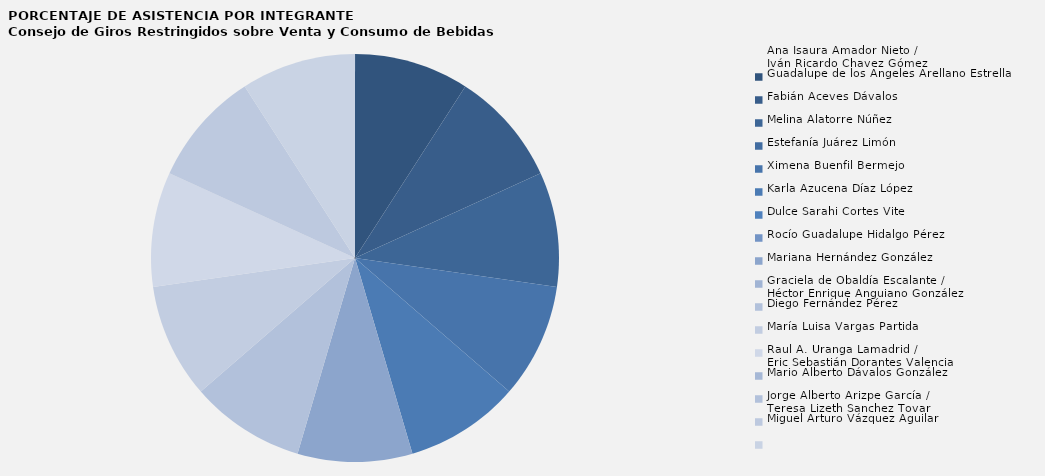
| Category | Ana Isaura Amador Nieto / 
Iván Ricardo Chavez Gómez |
|---|---|
| Ana Isaura Amador Nieto / 
Iván Ricardo Chavez Gómez | 100 |
| Guadalupe de los Ángeles Arellano Estrella | 100 |
| Fabián Aceves Dávalos | 100 |
| Melina Alatorre Núñez | 0 |
| Estefanía Juárez Limón | 100 |
| Ximena Buenfil Bermejo | 100 |
| Karla Azucena Díaz López | 0 |
| Dulce Sarahi Cortes Vite | 0 |
| Rocío Guadalupe Hidalgo Pérez | 100 |
| Mariana Hernández González  | 0 |
| Graciela de Obaldía Escalante / 
Héctor Enrique Anguiano González | 100 |
| Diego Fernández Pérez | 100 |
| María Luisa Vargas Partida | 100 |
| Raul A. Uranga Lamadrid / 
Eric Sebastián Dorantes Valencia  | 0 |
| Mario Alberto Dávalos González  | 0 |
| Jorge Alberto Arizpe García / 
Teresa Lizeth Sanchez Tovar | 100 |
| Miguel Arturo Vázquez Aguilar | 100 |
| Mario Alberto Espinosa Ceballos  | 0 |